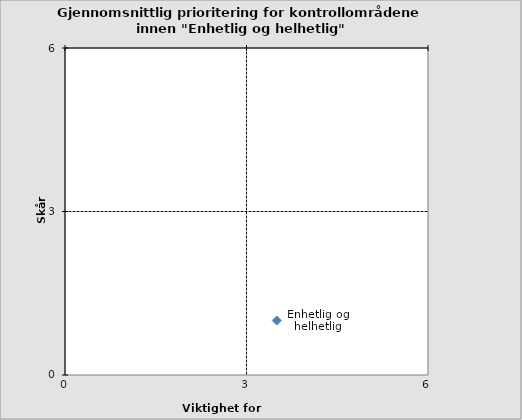
| Category | Enhetlig og helhetlig |
|---|---|
| 3.5 | 1 |